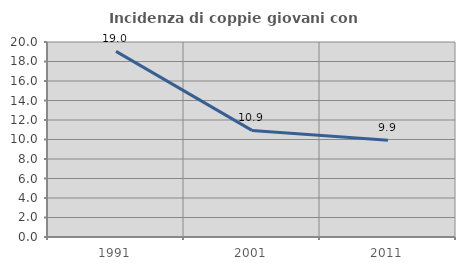
| Category | Incidenza di coppie giovani con figli |
|---|---|
| 1991.0 | 19.035 |
| 2001.0 | 10.933 |
| 2011.0 | 9.916 |